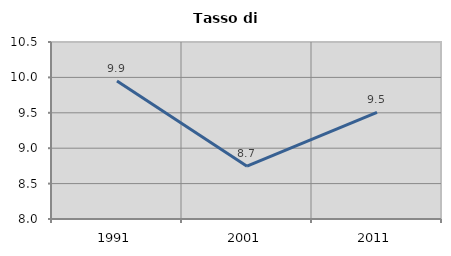
| Category | Tasso di disoccupazione   |
|---|---|
| 1991.0 | 9.948 |
| 2001.0 | 8.745 |
| 2011.0 | 9.507 |